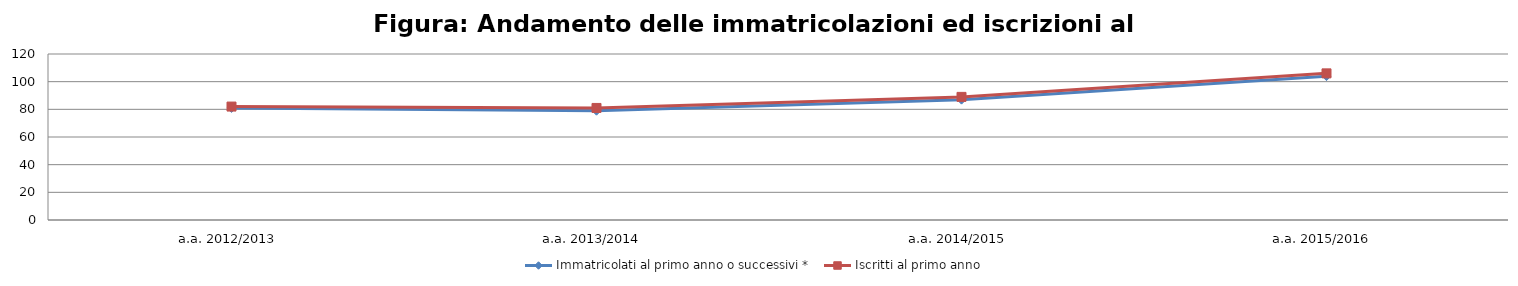
| Category | Immatricolati al primo anno o successivi * | Iscritti al primo anno  |
|---|---|---|
| a.a. 2012/2013 | 81 | 82 |
| a.a. 2013/2014 | 79 | 81 |
| a.a. 2014/2015 | 87 | 89 |
| a.a. 2015/2016 | 104 | 106 |